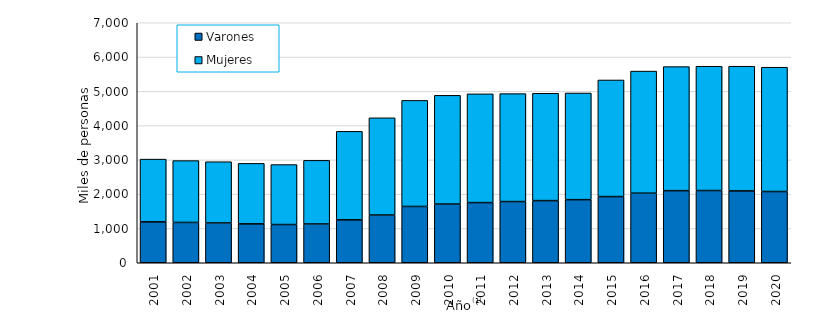
| Category | Varones | Mujeres |
|---|---|---|
| 2001.0 | 1193369 | 1829825 |
| 2002.0 | 1175989 | 1803977 |
| 2003.0 | 1161239 | 1785766 |
| 2004.0 | 1134869 | 1764005 |
| 2005.0 | 1115120 | 1749062 |
| 2006.0 | 1131393 | 1855504 |
| 2007.0 | 1252163 | 2581424 |
| 2008.0 | 1392284 | 2835170 |
| 2009.0 | 1642266 | 3093266 |
| 2010.0 | 1711844 | 3171536 |
| 2011.0 | 1754921 | 3171583 |
| 2012.0 | 1785047 | 3148319 |
| 2013.0 | 1812485 | 3130617 |
| 2014.0 | 1840009 | 3111015 |
| 2015.0 | 1929806 | 3401281 |
| 2016.0 | 2029585 | 3561014 |
| 2017.0 | 2103123 | 3617499 |
| 2018.0 | 2106528 | 3625108 |
| 2019.0 | 2096782 | 3635178 |
| 2020.0 | 2077506 | 3625930 |